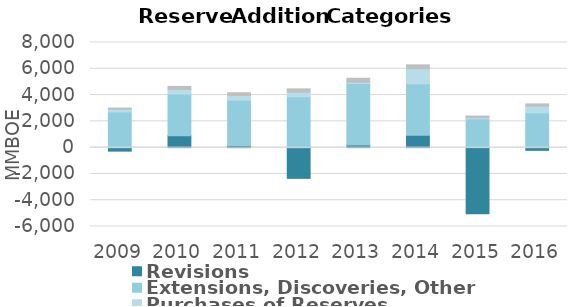
| Category | Revisions  | Extensions, Discoveries, Other  | Purchases of Reserves  | Improved Recovery  |
|---|---|---|---|---|
| 2009 | -266.351 | 2722.209 | 197.564 | 94.333 |
| 2010 | 907.16 | 3167.488 | 360.995 | 222.216 |
| 2011 | 158.02 | 3454.494 | 362.913 | 202.394 |
| 2012 | -2337.466 | 3867.888 | 349.61 | 256.498 |
| 2013 | 192.705 | 4683.994 | 102.227 | 298.5 |
| 2014 | 950.107 | 3900.464 | 1159.354 | 288.333 |
| 2015 | -5021.726 | 2184.2 | 98.181 | 122.5 |
| 2016 | -205.685 | 2645.576 | 517.064 | 165 |